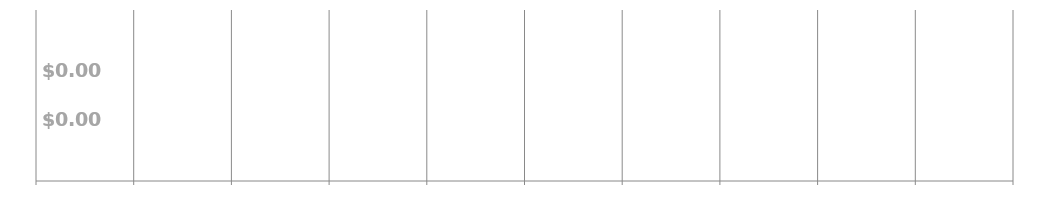
| Category | PRIOR YEAR BUDGET:  | PROJECTED BUDGET:  |
|---|---|---|
| 0 | 0 | 0 |